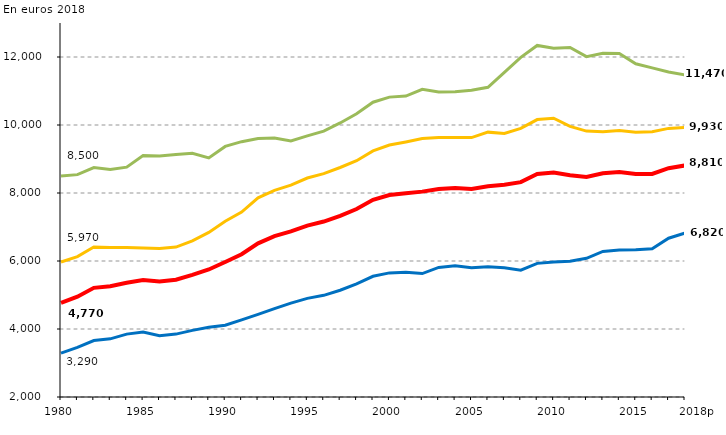
| Category | Dépense moyenne par élève | Dépense moyenne pour un élève du 1er degré | Dépense moyenne pour un élève du 2nd degré | Dépense moyenne pour un élève du supérieur |
|---|---|---|---|---|
| 1980 | 4770 | 3290 | 5970 | 8500 |
| 1981 | 4950 | 3460 | 6130 | 8540 |
| 1982 | 5210 | 3660 | 6410 | 8750 |
| 1983 | 5260 | 3710 | 6400 | 8690 |
| 1984 | 5360 | 3850 | 6400 | 8760 |
| 1985 | 5440 | 3910 | 6380 | 9100 |
| 1986 | 5400 | 3800 | 6370 | 9090 |
| 1987 | 5450 | 3850 | 6410 | 9130 |
| 1988 | 5590 | 3960 | 6590 | 9170 |
| 1989 | 5750 | 4050 | 6840 | 9030 |
| 1990 | 5970 | 4110 | 7170 | 9370 |
| 1991 | 6200 | 4270 | 7440 | 9510 |
| 1992 | 6520 | 4430 | 7860 | 9600 |
| 1993 | 6730 | 4600 | 8080 | 9620 |
| 1994 | 6870 | 4760 | 8230 | 9530 |
| 1995 | 7040 | 4900 | 8440 | 9680 |
| 1996 | 7160 | 4990 | 8570 | 9820 |
| 1997 | 7330 | 5140 | 8750 | 10060 |
| 1998 | 7530 | 5330 | 8950 | 10330 |
| 1999 | 7800 | 5550 | 9240 | 10670 |
| 2000 | 7940 | 5650 | 9410 | 10820 |
| 2001 | 7990 | 5670 | 9500 | 10850 |
| 2002 | 8040 | 5630 | 9600 | 11050 |
| 2003 | 8120 | 5810 | 9630 | 10970 |
| 2004 | 8150 | 5860 | 9630 | 10980 |
| 2005 | 8120 | 5800 | 9630 | 11020 |
| 2006 | 8200 | 5830 | 9790 | 11110 |
| 2007 | 8240 | 5800 | 9750 | 11550 |
| 2008 | 8320 | 5730 | 9900 | 11990 |
| 2009 | 8560 | 5930 | 10160 | 12340 |
| 2010 | 8600 | 5970 | 10200 | 12260 |
| 2011 | 8520 | 5990 | 9960 | 12280 |
| 2012 | 8470 | 6080 | 9820 | 12010 |
| 2013 | 8580 | 6280 | 9800 | 12110 |
| 2014 | 8620 | 6320 | 9840 | 12100 |
| 2015 | 8560 | 6330 | 9790 | 11800 |
| 2016 | 8560 | 6360 | 9800 | 11680 |
| 2017 | 8730 | 6670 | 9900 | 11560 |
| 2018p | 8810 | 6820 | 9930 | 11470 |